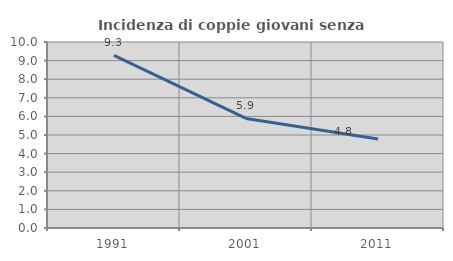
| Category | Incidenza di coppie giovani senza figli |
|---|---|
| 1991.0 | 9.279 |
| 2001.0 | 5.893 |
| 2011.0 | 4.787 |